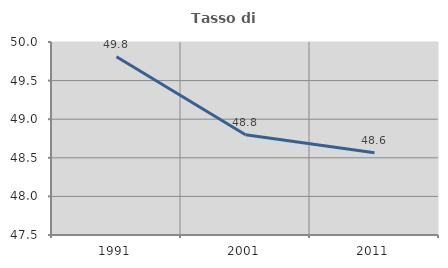
| Category | Tasso di occupazione   |
|---|---|
| 1991.0 | 49.81 |
| 2001.0 | 48.799 |
| 2011.0 | 48.567 |